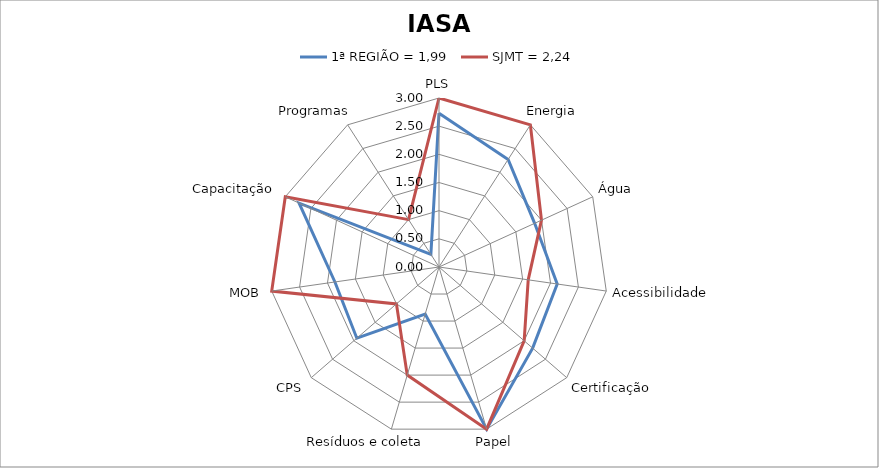
| Category | 1ª REGIÃO = 1,99 | SJMT = 2,24 |
|---|---|---|
| PLS | 2.73 | 3 |
| Energia | 2.27 | 3 |
| Água | 1.867 | 2 |
| Acessibilidade | 2.12 | 1.6 |
| Certificação | 2.2 | 2 |
| Papel | 3 | 3 |
| Resíduos e coleta | 0.87 | 2 |
| CPS | 1.93 | 1 |
| MOB | 1.867 | 3 |
| Capacitação | 2.73 | 3 |
| Programas | 0.267 | 1 |